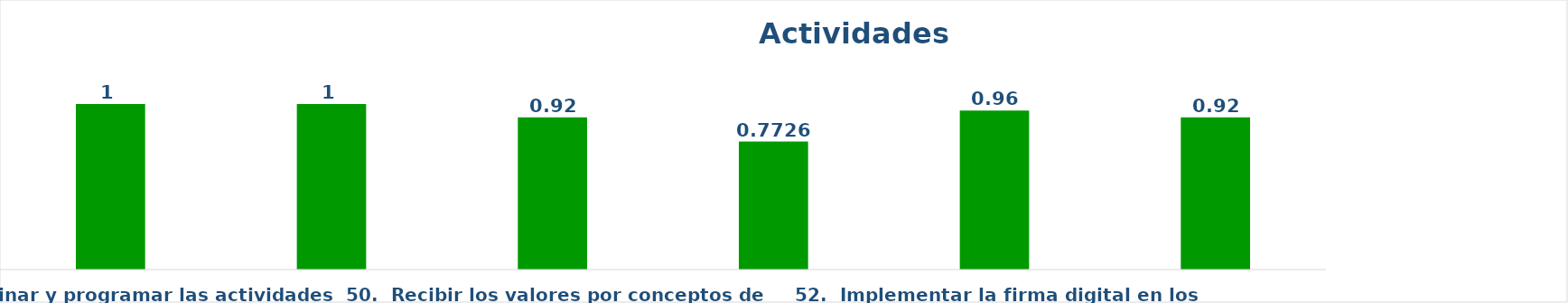
| Category | Series 0 |
|---|---|
| 48.  Coordinar y programar las actividades Financieras  de acuerdo al Presupuesto aprobado.   | 1 |
| 49.  Prestar los servicios de transportación para las diferentes áreas funcionales de la Institución. | 1 |
| 50.  Recibir los valores por conceptos de los servicios que ofrece la institución. | 0.92 |
| 51.  Autoevaluar y  Dar seguimiento a NOBACI (Normas Básicas de Control Interno CGR).   | 0.773 |
| 52.  Implementar la firma digital en los Servicios Catastrales | 0.96 |
| 53. Crear  mecanismos de interoperabilidad institucional. | 0.92 |